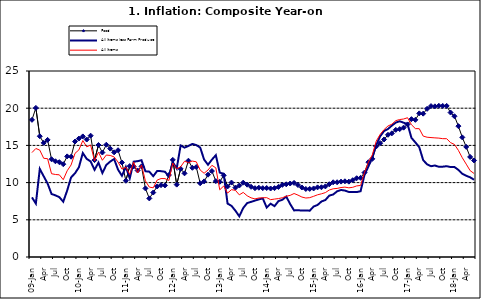
| Category | Food | All Items less Farm Produce | All Items |
|---|---|---|---|
| 09-Jan | 18.436 | 8.013 | 14.034 |
| Feb | 20.041 | 7.178 | 14.584 |
| Mar | 16.233 | 11.842 | 14.366 |
| Apr | 15.342 | 10.85 | 13.268 |
| May | 15.74 | 9.88 | 13.212 |
| June | 13.138 | 8.472 | 11.194 |
| Jul | 12.867 | 8.285 | 11.09 |
| Aug | 12.746 | 8.044 | 11.046 |
| Sep | 12.472 | 7.431 | 10.39 |
| Oct | 13.524 | 8.933 | 11.588 |
| Nov | 13.482 | 10.702 | 12.368 |
| Dec | 15.518 | 11.249 | 13.93 |
| 10-Jan | 15.918 | 12.063 | 14.398 |
| Feb | 16.208 | 13.978 | 15.649 |
| Mar | 15.79 | 13.184 | 14.812 |
| Apr | 16.306 | 12.844 | 15.044 |
| May | 13.023 | 11.711 | 12.915 |
| Jun | 15.053 | 12.686 | 14.099 |
| Jul | 14.043 | 11.287 | 13.002 |
| Aug | 15.09 | 12.366 | 13.702 |
| Sep | 14.57 | 12.83 | 13.65 |
| Oct | 14.065 | 13.168 | 13.45 |
| Nov | 14.351 | 11.746 | 12.766 |
| Dec | 12.701 | 10.917 | 11.815 |
| 11-Jan | 10.255 | 12.118 | 12.08 |
| Feb | 12.221 | 10.569 | 11.1 |
| Mar | 12.169 | 12.815 | 12.779 |
| Apr | 11.629 | 12.882 | 11.291 |
| May | 12.179 | 13.006 | 12.352 |
| Jun | 9.22 | 11.524 | 10.23 |
| Jul | 7.877 | 11.472 | 9.397 |
| Aug | 8.665 | 10.863 | 9.301 |
| Sep | 9.479 | 11.567 | 10.339 |
| Oct | 9.656 | 11.539 | 10.544 |
| Nov | 9.623 | 11.459 | 10.54 |
| Dec | 11.02 | 10.822 | 10.283 |
| 12-Jan | 13.053 | 12.748 | 12.626 |
| 12-Feb | 9.729 | 11.901 | 11.866 |
| 12-Mar | 11.848 | 14.995 | 12.111 |
| Apr | 11.246 | 14.703 | 12.866 |
| May | 12.942 | 14.926 | 12.688 |
| Jun | 11.991 | 15.199 | 12.892 |
| Jul | 12.093 | 15.045 | 12.797 |
| Aug | 9.91 | 14.714 | 11.689 |
| Sep | 10.164 | 13.101 | 11.253 |
| Oct | 11.064 | 12.398 | 11.693 |
| Nov | 11.553 | 13.092 | 12.32 |
| Dec | 10.199 | 13.685 | 11.981 |
| 13-Jan | 10.106 | 11.342 | 9.031 |
| Feb | 10.973 | 11.184 | 9.542 |
| Mar | 9.482 | 7.179 | 8.593 |
| Apr | 10.006 | 6.874 | 9.052 |
| May | 9.321 | 6.227 | 8.964 |
| Jun | 9.606 | 5.472 | 8.353 |
| Jul | 9.994 | 6.58 | 8.682 |
| Aug | 9.723 | 7.245 | 8.231 |
| Sep | 9.437 | 7.41 | 7.952 |
| Oct | 9.249 | 7.579 | 7.807 |
| Nov | 9.313 | 7.75 | 7.931 |
| Dec | 9.253 | 7.872 | 7.957 |
| 14-Jan | 9.271 | 6.648 | 7.977 |
| Feb | 9.207 | 7.166 | 7.707 |
| Mar | 9.254 | 6.836 | 7.783 |
| Apr | 9.414 | 7.508 | 7.851 |
| May | 9.698 | 7.693 | 7.965 |
| Jun | 9.776 | 8.122 | 8.167 |
| Jul | 9.878 | 7.116 | 8.281 |
| Aug | 9.959 | 6.264 | 8.534 |
| Sep | 9.676 | 6.278 | 8.317 |
| Oct | 9.343 | 6.252 | 8.06 |
| Nov | 9.144 | 6.255 | 7.927 |
| Dec | 9.152 | 6.225 | 7.978 |
| 15-Jan | 9.215 | 6.787 | 8.157 |
| Feb | 9.359 | 6.994 | 8.359 |
| Mar | 9.376 | 7.46 | 8.494 |
| Apr | 9.49 | 7.661 | 8.655 |
| May | 9.782 | 8.253 | 9.003 |
| Jun | 10.041 | 8.403 | 9.168 |
| Jul | 10.049 | 8.83 | 9.218 |
| Aug | 10.131 | 9.01 | 9.336 |
| Sep | 10.174 | 8.928 | 9.394 |
| Oct | 10.129 | 8.742 | 9.296 |
| Nov | 10.321 | 8.732 | 9.368 |
| Dec | 10.588 | 8.727 | 9.554 |
| 16-Jan | 10.642 | 8.841 | 9.617 |
| Feb | 11.348 | 11.041 | 11.379 |
| Mar | 12.745 | 12.17 | 12.775 |
| Apr | 13.194 | 13.352 | 13.721 |
| May | 14.861 | 15.054 | 15.577 |
| Jun | 15.302 | 16.224 | 16.48 |
| Jul | 15.799 | 16.929 | 17.127 |
| Aug | 16.427 | 17.208 | 17.609 |
| Sep | 16.622 | 17.666 | 17.852 |
| Oct | 17.09 | 18.067 | 18.33 |
| Nov | 17.191 | 18.241 | 18.476 |
| Dec | 17.388 | 18.052 | 18.547 |
| 17-Jan | 17.818 | 17.867 | 18.719 |
| Feb | 18.528 | 16.011 | 17.78 |
| Mar | 18.436 | 15.404 | 17.256 |
| Apr | 19.303 | 14.75 | 17.244 |
| May | 19.266 | 13.016 | 16.251 |
| Jun | 19.915 | 12.455 | 16.098 |
| Jul | 20.284 | 12.207 | 16.053 |
| Aug | 20.251 | 12.296 | 16.012 |
| Sep | 20.321 | 12.123 | 15.979 |
| Oct | 20.306 | 12.142 | 15.905 |
| Nov | 20.308 | 12.206 | 15.901 |
| Dec | 19.415 | 12.089 | 15.372 |
| 18-Jan | 18.919 | 12.09 | 15.127 |
| Feb | 17.588 | 11.707 | 14.33 |
| Mar | 16.08 | 11.181 | 13.337 |
| Apr | 14.799 | 10.92 | 12.482 |
| May | 13.448 | 10.71 | 11.608 |
| June | 12.977 | 10.387 | 11.231 |